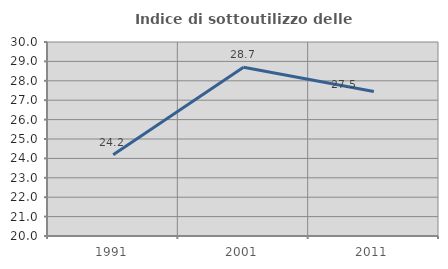
| Category | Indice di sottoutilizzo delle abitazioni  |
|---|---|
| 1991.0 | 24.192 |
| 2001.0 | 28.702 |
| 2011.0 | 27.453 |